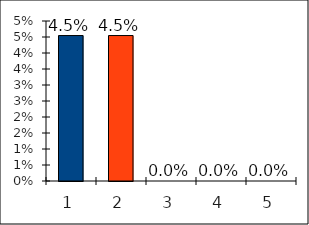
| Category | Series 0 |
|---|---|
| 0 | 0.045 |
| 1 | 0.045 |
| 2 | 0 |
| 3 | 0 |
| 4 | 0 |